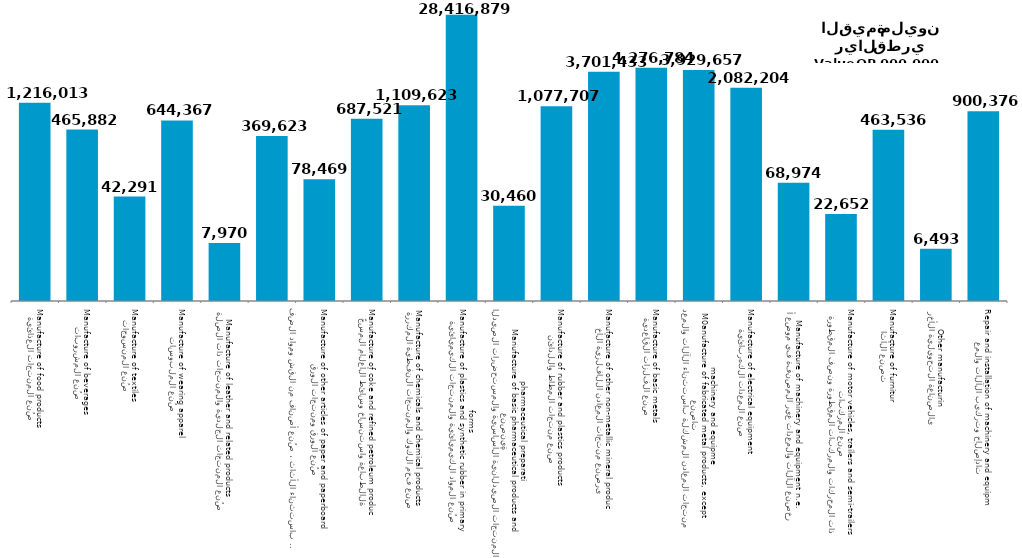
| Category | Series 1 |
|---|---|
| صُنع المنتجات الغذائية
Manufacture of food products | 1216013 |
| صُنع المشروبات
Manufacture of beverages | 465882 |
| صُنع المنسوجات
Manufacture of textiles | 42291 |
| صُنع الملبوسات
Manufacture of wearing apparel | 644367 |
| صُنع المنتجات الجلدية والمنتجات ذات الصلة
Manufacture of leather and related products | 7970 |
| صُنع الخشب ومنتجات الخشب والفلين ، باستثناء الأثاث ، صُنع أصناف من القش ومواد الضفر
Manufacture of wood and of products of wood and cork, except furniture, manufacture of aeticles of straw and plaiting materials plaiting materials | 369623 |
| صُنع الورق ومنتجات الورق
Manufacture of other articles of paper and paperboard | 78469 |
| الطباعة واستنساخ وسائط الأعلام المسجّلة
Manufacture of coke and refined petroleum products | 687521 |
| صنع فحم الكوك والمنتجات النفطية المكررة
Manufacture of chemicals and chemical products | 1109623 |
| صُنع المواد الكيميائية والمنتجات الكيميائية
Manufacture of plastics and synthetic rubber in primary forms | 28416879 |
| صنع المنتجات الصيدلانية الأساسية والمستحضرات الصيدلانية
Manufacture of basic pharmaceutical products and pharmaceutical preparations | 30460 |
| صنع منتجات المطاط واللدائن
Manufacture of rubber and plastics products | 1077707 |
| صنع منتجات المعادن اللافلزية الأخرى
Manufacture of other non-metallic mineral products | 3701433 |
| صنع الفلزات القاعدية
Manufacture of basic metals | 4276784 |
| صنع منتجات المعادن المشكلة باستثناء الآلات والمعدات
M0anufacture of fabricated metal products, except machinery and equipment | 3929657 |
| صنع المعدات الكهربائية
Manufacture of electrical equipment | 2082204 |
| صنع الآلات والمعدات غير المصنفة في موضع أخر
Manufacture of machinery and equipment n.e.c. | 68974 |
| صنع المركبات ذات المحركات والمركبات المقطورة ونصف المقطورة
Manufacture of motor vehicles, trailers and semi-trailers | 22652 |
| صنع الأثاث
Manufacture of furniture | 463536 |
| الصناعة التحويلية الأخرى
Other manufacturing | 6493 |
| إصلاح وتركيب الآلات والمعدات
Repair and installation of machinery and equipment | 900376 |